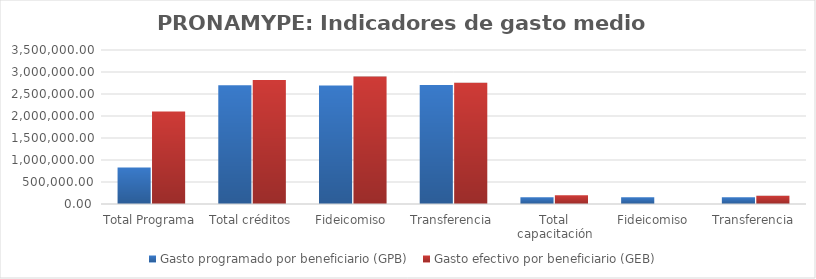
| Category | Gasto programado por beneficiario (GPB)  | Gasto efectivo por beneficiario (GEB)  |
|---|---|---|
| Total Programa | 832000 | 2104489.65 |
| Total créditos | 2700000 | 2817464.262 |
| Fideicomiso | 2695417.79 | 2896275.72 |
| Transferencia | 2702702.703 | 2757830.258 |
| Total capacitación | 152727.273 | 197192.084 |
| Fideicomiso | 152866.242 | 0 |
| Transferencia | 152671.756 | 189472.596 |